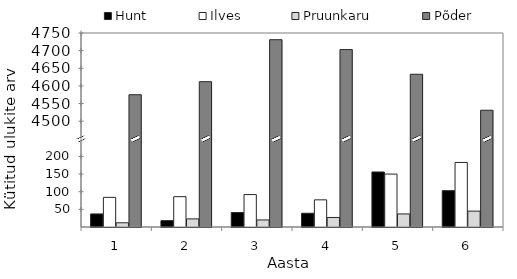
| Category | Hunt | Ilves | Pruunkaru | Põder |
|---|---|---|---|---|
| 1.0 | 37 | 84 | 12 | 375 |
| 2.0 | 18 | 86 | 23 | 412 |
| 3.0 | 41 | 92 | 20 | 531 |
| 4.0 | 39 | 77 | 27 | 503 |
| 5.0 | 156 | 150 | 37 | 433 |
| 6.0 | 103 | 183 | 45 | 331 |